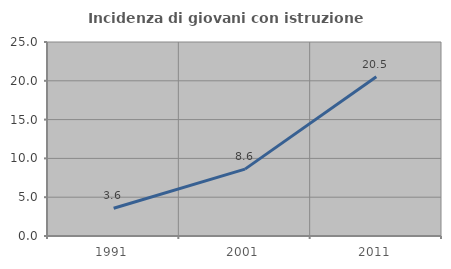
| Category | Incidenza di giovani con istruzione universitaria |
|---|---|
| 1991.0 | 3.571 |
| 2001.0 | 8.621 |
| 2011.0 | 20.513 |